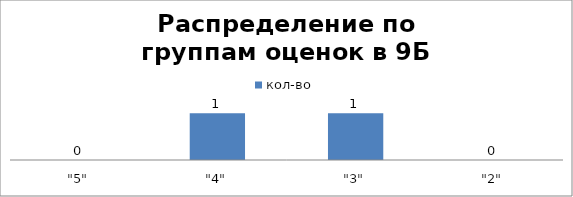
| Category | кол-во |
|---|---|
| "5" | 0 |
| "4" | 1 |
| "3" | 1 |
| "2" | 0 |